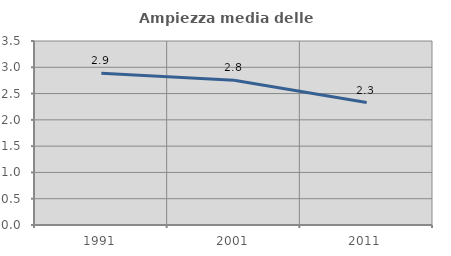
| Category | Ampiezza media delle famiglie |
|---|---|
| 1991.0 | 2.885 |
| 2001.0 | 2.753 |
| 2011.0 | 2.329 |